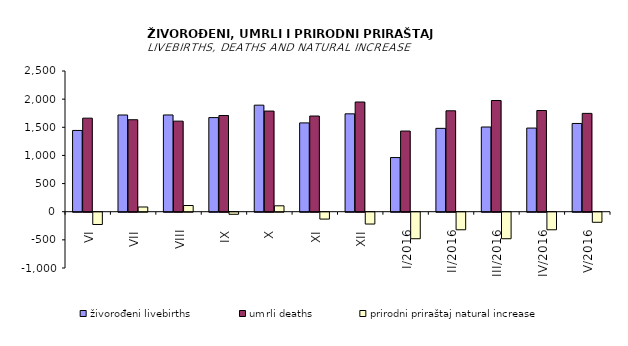
| Category | živorođeni livebirths | umrli deaths | prirodni priraštaj natural increase |
|---|---|---|---|
| VI | 1444 | 1662 | -218 |
| VII | 1718 | 1634 | 84 |
| VIII | 1719 | 1609 | 110 |
| IX | 1672 | 1709 | -37 |
| X | 1893 | 1788 | 105 |
| XI | 1578 | 1700 | -122 |
| XII | 1739 | 1949 | -210 |
| I/2016 | 962 | 1433 | -471 |
| II/2016 | 1481 | 1793 | -312 |
| III/2016 | 1505 | 1976 | -471 |
| IV/2016 | 1486 | 1798 | -312 |
| V/2016 | 1568 | 1747 | -179 |